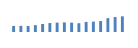
| Category | Exportações (1) |
|---|---|
| 0 | 203692.629 |
| 1 | 204985.899 |
| 2 | 199789.293 |
| 3 | 228223.553 |
| 4 | 265930.688 |
| 5 | 297441.741 |
| 6 | 313195.508 |
| 7 | 319331.634 |
| 8 | 313646.514 |
| 9 | 292708.824 |
| 10 | 335676.548 |
| 11 | 346139.442 |
| 12 | 364472.386 |
| 13 | 462235.534 |
| 14 | 497984.021 |
| 15 | 521225.815 |